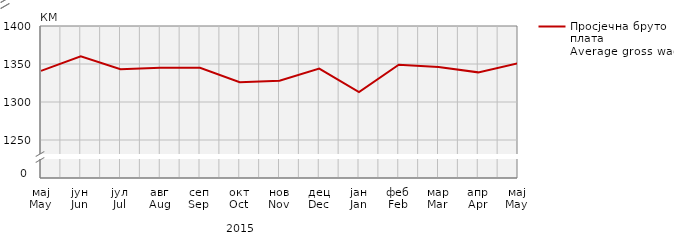
| Category | Просјечна бруто плата
Average gross wage |
|---|---|
| мај
May | 1341 |
| јун
Jun | 1360 |
| јул
Jul | 1343 |
| авг
Aug | 1345 |
| сеп
Sep | 1345 |
| окт
Oct | 1326 |
| нов
Nov | 1328 |
| дец
Dec | 1344 |
| јан
Jan | 1313 |
| феб
Feb | 1349 |
| мар
Mar | 1346 |
| апр
Apr | 1339 |
| мај
May | 1351 |